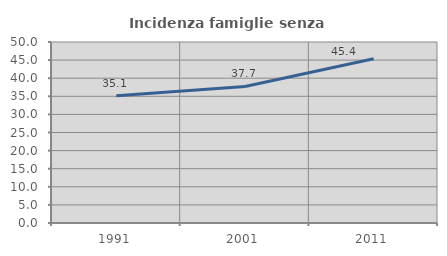
| Category | Incidenza famiglie senza nuclei |
|---|---|
| 1991.0 | 35.145 |
| 2001.0 | 37.73 |
| 2011.0 | 45.368 |